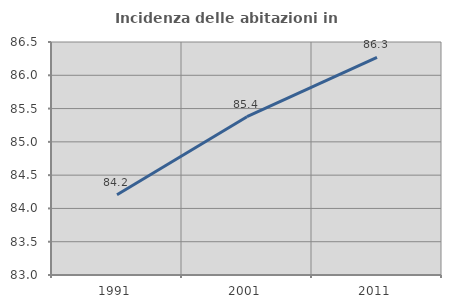
| Category | Incidenza delle abitazioni in proprietà  |
|---|---|
| 1991.0 | 84.206 |
| 2001.0 | 85.378 |
| 2011.0 | 86.267 |